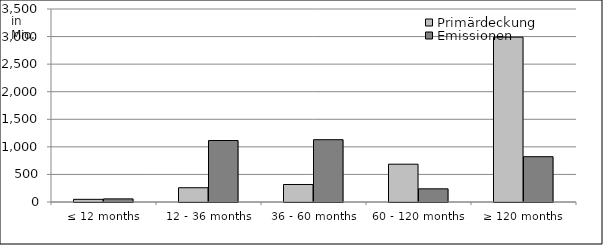
| Category | Primärdeckung | Emissionen |
|---|---|---|
| ≤ 12 months | 48175419.99 | 56463729.97 |
| 12 - 36 months | 258595872.45 | 1114828420.78 |
| 36 - 60 months | 317525942.757 | 1129783788.5 |
| 60 - 120 months | 685489771.527 | 239150000 |
| ≥ 120 months | 2989365803.739 | 821449155.66 |